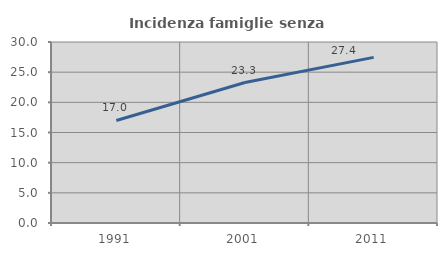
| Category | Incidenza famiglie senza nuclei |
|---|---|
| 1991.0 | 16.999 |
| 2001.0 | 23.283 |
| 2011.0 | 27.447 |